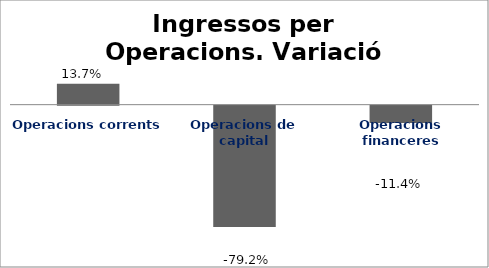
| Category | Series 0 |
|---|---|
| Operacions corrents | 0.137 |
| Operacions de capital | -0.792 |
| Operacions financeres | -0.114 |